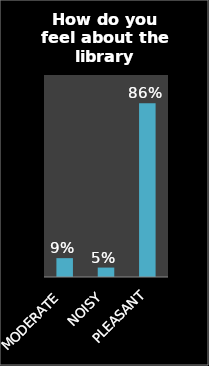
| Category | Series 0 |
|---|---|
| MODERATE | 0.093 |
| NOISY | 0.047 |
| PLEASANT | 0.86 |